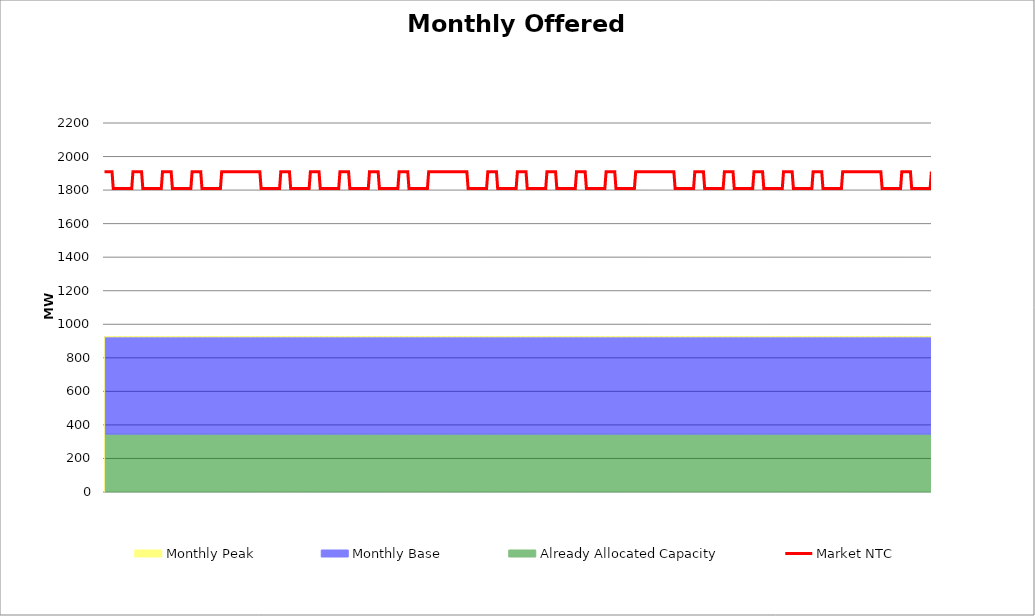
| Category | Market NTC |
|---|---|
| 0 | 1910 |
| 1 | 1910 |
| 2 | 1910 |
| 3 | 1910 |
| 4 | 1910 |
| 5 | 1910 |
| 6 | 1910 |
| 7 | 1810 |
| 8 | 1810 |
| 9 | 1810 |
| 10 | 1810 |
| 11 | 1810 |
| 12 | 1810 |
| 13 | 1810 |
| 14 | 1810 |
| 15 | 1810 |
| 16 | 1810 |
| 17 | 1810 |
| 18 | 1810 |
| 19 | 1810 |
| 20 | 1810 |
| 21 | 1810 |
| 22 | 1810 |
| 23 | 1910 |
| 24 | 1910 |
| 25 | 1910 |
| 26 | 1910 |
| 27 | 1910 |
| 28 | 1910 |
| 29 | 1910 |
| 30 | 1910 |
| 31 | 1810 |
| 32 | 1810 |
| 33 | 1810 |
| 34 | 1810 |
| 35 | 1810 |
| 36 | 1810 |
| 37 | 1810 |
| 38 | 1810 |
| 39 | 1810 |
| 40 | 1810 |
| 41 | 1810 |
| 42 | 1810 |
| 43 | 1810 |
| 44 | 1810 |
| 45 | 1810 |
| 46 | 1810 |
| 47 | 1910 |
| 48 | 1910 |
| 49 | 1910 |
| 50 | 1910 |
| 51 | 1910 |
| 52 | 1910 |
| 53 | 1910 |
| 54 | 1910 |
| 55 | 1810 |
| 56 | 1810 |
| 57 | 1810 |
| 58 | 1810 |
| 59 | 1810 |
| 60 | 1810 |
| 61 | 1810 |
| 62 | 1810 |
| 63 | 1810 |
| 64 | 1810 |
| 65 | 1810 |
| 66 | 1810 |
| 67 | 1810 |
| 68 | 1810 |
| 69 | 1810 |
| 70 | 1810 |
| 71 | 1910 |
| 72 | 1910 |
| 73 | 1910 |
| 74 | 1910 |
| 75 | 1910 |
| 76 | 1910 |
| 77 | 1910 |
| 78 | 1910 |
| 79 | 1810 |
| 80 | 1810 |
| 81 | 1810 |
| 82 | 1810 |
| 83 | 1810 |
| 84 | 1810 |
| 85 | 1810 |
| 86 | 1810 |
| 87 | 1810 |
| 88 | 1810 |
| 89 | 1810 |
| 90 | 1810 |
| 91 | 1810 |
| 92 | 1810 |
| 93 | 1810 |
| 94 | 1810 |
| 95 | 1910 |
| 96 | 1910 |
| 97 | 1910 |
| 98 | 1910 |
| 99 | 1910 |
| 100 | 1910 |
| 101 | 1910 |
| 102 | 1910 |
| 103 | 1910 |
| 104 | 1910 |
| 105 | 1910 |
| 106 | 1910 |
| 107 | 1910 |
| 108 | 1910 |
| 109 | 1910 |
| 110 | 1910 |
| 111 | 1910 |
| 112 | 1910 |
| 113 | 1910 |
| 114 | 1910 |
| 115 | 1910 |
| 116 | 1910 |
| 117 | 1910 |
| 118 | 1910 |
| 119 | 1910 |
| 120 | 1910 |
| 121 | 1910 |
| 122 | 1910 |
| 123 | 1910 |
| 124 | 1910 |
| 125 | 1910 |
| 126 | 1910 |
| 127 | 1810 |
| 128 | 1810 |
| 129 | 1810 |
| 130 | 1810 |
| 131 | 1810 |
| 132 | 1810 |
| 133 | 1810 |
| 134 | 1810 |
| 135 | 1810 |
| 136 | 1810 |
| 137 | 1810 |
| 138 | 1810 |
| 139 | 1810 |
| 140 | 1810 |
| 141 | 1810 |
| 142 | 1810 |
| 143 | 1910 |
| 144 | 1910 |
| 145 | 1910 |
| 146 | 1910 |
| 147 | 1910 |
| 148 | 1910 |
| 149 | 1910 |
| 150 | 1910 |
| 151 | 1810 |
| 152 | 1810 |
| 153 | 1810 |
| 154 | 1810 |
| 155 | 1810 |
| 156 | 1810 |
| 157 | 1810 |
| 158 | 1810 |
| 159 | 1810 |
| 160 | 1810 |
| 161 | 1810 |
| 162 | 1810 |
| 163 | 1810 |
| 164 | 1810 |
| 165 | 1810 |
| 166 | 1810 |
| 167 | 1910 |
| 168 | 1910 |
| 169 | 1910 |
| 170 | 1910 |
| 171 | 1910 |
| 172 | 1910 |
| 173 | 1910 |
| 174 | 1910 |
| 175 | 1810 |
| 176 | 1810 |
| 177 | 1810 |
| 178 | 1810 |
| 179 | 1810 |
| 180 | 1810 |
| 181 | 1810 |
| 182 | 1810 |
| 183 | 1810 |
| 184 | 1810 |
| 185 | 1810 |
| 186 | 1810 |
| 187 | 1810 |
| 188 | 1810 |
| 189 | 1810 |
| 190 | 1810 |
| 191 | 1910 |
| 192 | 1910 |
| 193 | 1910 |
| 194 | 1910 |
| 195 | 1910 |
| 196 | 1910 |
| 197 | 1910 |
| 198 | 1910 |
| 199 | 1810 |
| 200 | 1810 |
| 201 | 1810 |
| 202 | 1810 |
| 203 | 1810 |
| 204 | 1810 |
| 205 | 1810 |
| 206 | 1810 |
| 207 | 1810 |
| 208 | 1810 |
| 209 | 1810 |
| 210 | 1810 |
| 211 | 1810 |
| 212 | 1810 |
| 213 | 1810 |
| 214 | 1810 |
| 215 | 1910 |
| 216 | 1910 |
| 217 | 1910 |
| 218 | 1910 |
| 219 | 1910 |
| 220 | 1910 |
| 221 | 1910 |
| 222 | 1910 |
| 223 | 1810 |
| 224 | 1810 |
| 225 | 1810 |
| 226 | 1810 |
| 227 | 1810 |
| 228 | 1810 |
| 229 | 1810 |
| 230 | 1810 |
| 231 | 1810 |
| 232 | 1810 |
| 233 | 1810 |
| 234 | 1810 |
| 235 | 1810 |
| 236 | 1810 |
| 237 | 1810 |
| 238 | 1810 |
| 239 | 1910 |
| 240 | 1910 |
| 241 | 1910 |
| 242 | 1910 |
| 243 | 1910 |
| 244 | 1910 |
| 245 | 1910 |
| 246 | 1910 |
| 247 | 1810 |
| 248 | 1810 |
| 249 | 1810 |
| 250 | 1810 |
| 251 | 1810 |
| 252 | 1810 |
| 253 | 1810 |
| 254 | 1810 |
| 255 | 1810 |
| 256 | 1810 |
| 257 | 1810 |
| 258 | 1810 |
| 259 | 1810 |
| 260 | 1810 |
| 261 | 1810 |
| 262 | 1810 |
| 263 | 1910 |
| 264 | 1910 |
| 265 | 1910 |
| 266 | 1910 |
| 267 | 1910 |
| 268 | 1910 |
| 269 | 1910 |
| 270 | 1910 |
| 271 | 1910 |
| 272 | 1910 |
| 273 | 1910 |
| 274 | 1910 |
| 275 | 1910 |
| 276 | 1910 |
| 277 | 1910 |
| 278 | 1910 |
| 279 | 1910 |
| 280 | 1910 |
| 281 | 1910 |
| 282 | 1910 |
| 283 | 1910 |
| 284 | 1910 |
| 285 | 1910 |
| 286 | 1910 |
| 287 | 1910 |
| 288 | 1910 |
| 289 | 1910 |
| 290 | 1910 |
| 291 | 1910 |
| 292 | 1910 |
| 293 | 1910 |
| 294 | 1910 |
| 295 | 1810 |
| 296 | 1810 |
| 297 | 1810 |
| 298 | 1810 |
| 299 | 1810 |
| 300 | 1810 |
| 301 | 1810 |
| 302 | 1810 |
| 303 | 1810 |
| 304 | 1810 |
| 305 | 1810 |
| 306 | 1810 |
| 307 | 1810 |
| 308 | 1810 |
| 309 | 1810 |
| 310 | 1810 |
| 311 | 1910 |
| 312 | 1910 |
| 313 | 1910 |
| 314 | 1910 |
| 315 | 1910 |
| 316 | 1910 |
| 317 | 1910 |
| 318 | 1910 |
| 319 | 1810 |
| 320 | 1810 |
| 321 | 1810 |
| 322 | 1810 |
| 323 | 1810 |
| 324 | 1810 |
| 325 | 1810 |
| 326 | 1810 |
| 327 | 1810 |
| 328 | 1810 |
| 329 | 1810 |
| 330 | 1810 |
| 331 | 1810 |
| 332 | 1810 |
| 333 | 1810 |
| 334 | 1810 |
| 335 | 1910 |
| 336 | 1910 |
| 337 | 1910 |
| 338 | 1910 |
| 339 | 1910 |
| 340 | 1910 |
| 341 | 1910 |
| 342 | 1910 |
| 343 | 1810 |
| 344 | 1810 |
| 345 | 1810 |
| 346 | 1810 |
| 347 | 1810 |
| 348 | 1810 |
| 349 | 1810 |
| 350 | 1810 |
| 351 | 1810 |
| 352 | 1810 |
| 353 | 1810 |
| 354 | 1810 |
| 355 | 1810 |
| 356 | 1810 |
| 357 | 1810 |
| 358 | 1810 |
| 359 | 1910 |
| 360 | 1910 |
| 361 | 1910 |
| 362 | 1910 |
| 363 | 1910 |
| 364 | 1910 |
| 365 | 1910 |
| 366 | 1910 |
| 367 | 1810 |
| 368 | 1810 |
| 369 | 1810 |
| 370 | 1810 |
| 371 | 1810 |
| 372 | 1810 |
| 373 | 1810 |
| 374 | 1810 |
| 375 | 1810 |
| 376 | 1810 |
| 377 | 1810 |
| 378 | 1810 |
| 379 | 1810 |
| 380 | 1810 |
| 381 | 1810 |
| 382 | 1810 |
| 383 | 1910 |
| 384 | 1910 |
| 385 | 1910 |
| 386 | 1910 |
| 387 | 1910 |
| 388 | 1910 |
| 389 | 1910 |
| 390 | 1910 |
| 391 | 1810 |
| 392 | 1810 |
| 393 | 1810 |
| 394 | 1810 |
| 395 | 1810 |
| 396 | 1810 |
| 397 | 1810 |
| 398 | 1810 |
| 399 | 1810 |
| 400 | 1810 |
| 401 | 1810 |
| 402 | 1810 |
| 403 | 1810 |
| 404 | 1810 |
| 405 | 1810 |
| 406 | 1810 |
| 407 | 1910 |
| 408 | 1910 |
| 409 | 1910 |
| 410 | 1910 |
| 411 | 1910 |
| 412 | 1910 |
| 413 | 1910 |
| 414 | 1910 |
| 415 | 1810 |
| 416 | 1810 |
| 417 | 1810 |
| 418 | 1810 |
| 419 | 1810 |
| 420 | 1810 |
| 421 | 1810 |
| 422 | 1810 |
| 423 | 1810 |
| 424 | 1810 |
| 425 | 1810 |
| 426 | 1810 |
| 427 | 1810 |
| 428 | 1810 |
| 429 | 1810 |
| 430 | 1810 |
| 431 | 1910 |
| 432 | 1910 |
| 433 | 1910 |
| 434 | 1910 |
| 435 | 1910 |
| 436 | 1910 |
| 437 | 1910 |
| 438 | 1910 |
| 439 | 1910 |
| 440 | 1910 |
| 441 | 1910 |
| 442 | 1910 |
| 443 | 1910 |
| 444 | 1910 |
| 445 | 1910 |
| 446 | 1910 |
| 447 | 1910 |
| 448 | 1910 |
| 449 | 1910 |
| 450 | 1910 |
| 451 | 1910 |
| 452 | 1910 |
| 453 | 1910 |
| 454 | 1910 |
| 455 | 1910 |
| 456 | 1910 |
| 457 | 1910 |
| 458 | 1910 |
| 459 | 1910 |
| 460 | 1910 |
| 461 | 1910 |
| 462 | 1910 |
| 463 | 1810 |
| 464 | 1810 |
| 465 | 1810 |
| 466 | 1810 |
| 467 | 1810 |
| 468 | 1810 |
| 469 | 1810 |
| 470 | 1810 |
| 471 | 1810 |
| 472 | 1810 |
| 473 | 1810 |
| 474 | 1810 |
| 475 | 1810 |
| 476 | 1810 |
| 477 | 1810 |
| 478 | 1810 |
| 479 | 1910 |
| 480 | 1910 |
| 481 | 1910 |
| 482 | 1910 |
| 483 | 1910 |
| 484 | 1910 |
| 485 | 1910 |
| 486 | 1910 |
| 487 | 1810 |
| 488 | 1810 |
| 489 | 1810 |
| 490 | 1810 |
| 491 | 1810 |
| 492 | 1810 |
| 493 | 1810 |
| 494 | 1810 |
| 495 | 1810 |
| 496 | 1810 |
| 497 | 1810 |
| 498 | 1810 |
| 499 | 1810 |
| 500 | 1810 |
| 501 | 1810 |
| 502 | 1810 |
| 503 | 1910 |
| 504 | 1910 |
| 505 | 1910 |
| 506 | 1910 |
| 507 | 1910 |
| 508 | 1910 |
| 509 | 1910 |
| 510 | 1910 |
| 511 | 1810 |
| 512 | 1810 |
| 513 | 1810 |
| 514 | 1810 |
| 515 | 1810 |
| 516 | 1810 |
| 517 | 1810 |
| 518 | 1810 |
| 519 | 1810 |
| 520 | 1810 |
| 521 | 1810 |
| 522 | 1810 |
| 523 | 1810 |
| 524 | 1810 |
| 525 | 1810 |
| 526 | 1810 |
| 527 | 1910 |
| 528 | 1910 |
| 529 | 1910 |
| 530 | 1910 |
| 531 | 1910 |
| 532 | 1910 |
| 533 | 1910 |
| 534 | 1910 |
| 535 | 1810 |
| 536 | 1810 |
| 537 | 1810 |
| 538 | 1810 |
| 539 | 1810 |
| 540 | 1810 |
| 541 | 1810 |
| 542 | 1810 |
| 543 | 1810 |
| 544 | 1810 |
| 545 | 1810 |
| 546 | 1810 |
| 547 | 1810 |
| 548 | 1810 |
| 549 | 1810 |
| 550 | 1810 |
| 551 | 1910 |
| 552 | 1910 |
| 553 | 1910 |
| 554 | 1910 |
| 555 | 1910 |
| 556 | 1910 |
| 557 | 1910 |
| 558 | 1910 |
| 559 | 1810 |
| 560 | 1810 |
| 561 | 1810 |
| 562 | 1810 |
| 563 | 1810 |
| 564 | 1810 |
| 565 | 1810 |
| 566 | 1810 |
| 567 | 1810 |
| 568 | 1810 |
| 569 | 1810 |
| 570 | 1810 |
| 571 | 1810 |
| 572 | 1810 |
| 573 | 1810 |
| 574 | 1810 |
| 575 | 1910 |
| 576 | 1910 |
| 577 | 1910 |
| 578 | 1910 |
| 579 | 1910 |
| 580 | 1910 |
| 581 | 1910 |
| 582 | 1910 |
| 583 | 1810 |
| 584 | 1810 |
| 585 | 1810 |
| 586 | 1810 |
| 587 | 1810 |
| 588 | 1810 |
| 589 | 1810 |
| 590 | 1810 |
| 591 | 1810 |
| 592 | 1810 |
| 593 | 1810 |
| 594 | 1810 |
| 595 | 1810 |
| 596 | 1810 |
| 597 | 1810 |
| 598 | 1810 |
| 599 | 1910 |
| 600 | 1910 |
| 601 | 1910 |
| 602 | 1910 |
| 603 | 1910 |
| 604 | 1910 |
| 605 | 1910 |
| 606 | 1910 |
| 607 | 1910 |
| 608 | 1910 |
| 609 | 1910 |
| 610 | 1910 |
| 611 | 1910 |
| 612 | 1910 |
| 613 | 1910 |
| 614 | 1910 |
| 615 | 1910 |
| 616 | 1910 |
| 617 | 1910 |
| 618 | 1910 |
| 619 | 1910 |
| 620 | 1910 |
| 621 | 1910 |
| 622 | 1910 |
| 623 | 1910 |
| 624 | 1910 |
| 625 | 1910 |
| 626 | 1910 |
| 627 | 1910 |
| 628 | 1910 |
| 629 | 1910 |
| 630 | 1910 |
| 631 | 1810 |
| 632 | 1810 |
| 633 | 1810 |
| 634 | 1810 |
| 635 | 1810 |
| 636 | 1810 |
| 637 | 1810 |
| 638 | 1810 |
| 639 | 1810 |
| 640 | 1810 |
| 641 | 1810 |
| 642 | 1810 |
| 643 | 1810 |
| 644 | 1810 |
| 645 | 1810 |
| 646 | 1810 |
| 647 | 1910 |
| 648 | 1910 |
| 649 | 1910 |
| 650 | 1910 |
| 651 | 1910 |
| 652 | 1910 |
| 653 | 1910 |
| 654 | 1910 |
| 655 | 1810 |
| 656 | 1810 |
| 657 | 1810 |
| 658 | 1810 |
| 659 | 1810 |
| 660 | 1810 |
| 661 | 1810 |
| 662 | 1810 |
| 663 | 1810 |
| 664 | 1810 |
| 665 | 1810 |
| 666 | 1810 |
| 667 | 1810 |
| 668 | 1810 |
| 669 | 1810 |
| 670 | 1810 |
| 671 | 1910 |